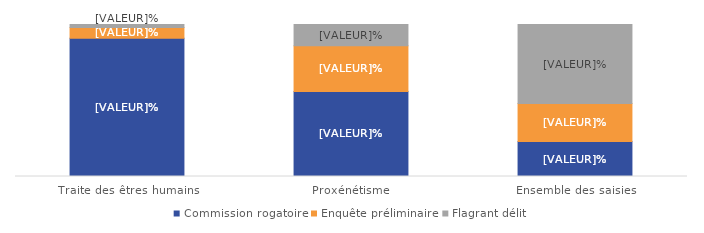
| Category | Commission rogatoire | Enquête préliminaire | Flagrant délit |
|---|---|---|---|
| Traite des êtres humains | 90 | 7 | 2 |
| Proxénétisme | 56 | 30 | 14 |
| Ensemble des saisies | 23 | 25 | 52 |